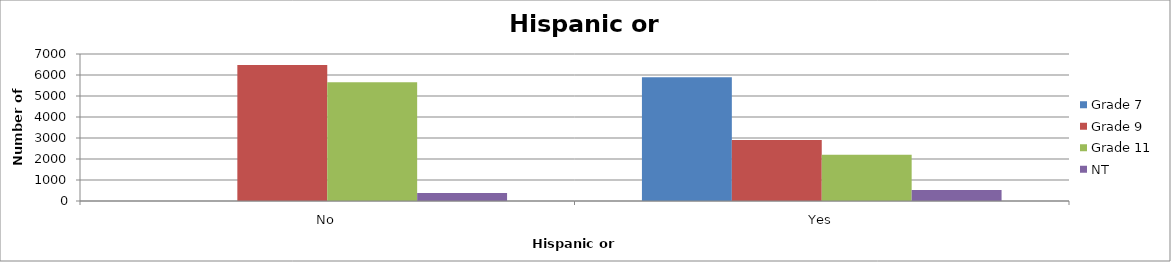
| Category | Grade 7 | Grade 9 | Grade 11 | NT |
|---|---|---|---|---|
| No | 0 | 6471.51 | 5657.04 | 375.06 |
| Yes | 5893 | 2907.49 | 2199.96 | 517.94 |